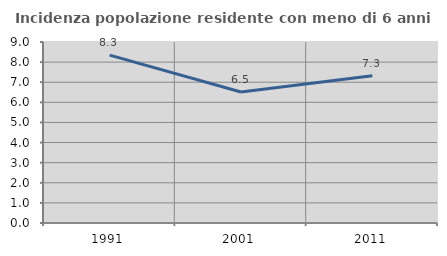
| Category | Incidenza popolazione residente con meno di 6 anni |
|---|---|
| 1991.0 | 8.346 |
| 2001.0 | 6.516 |
| 2011.0 | 7.317 |